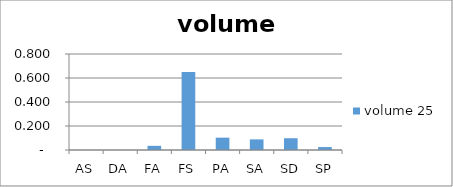
| Category |  volume 25  |
|---|---|
| AS | 0 |
| DA | 0 |
| FA | 0.035 |
| FS | 0.651 |
| PA | 0.103 |
| SA | 0.088 |
| SD | 0.098 |
| SP | 0.025 |